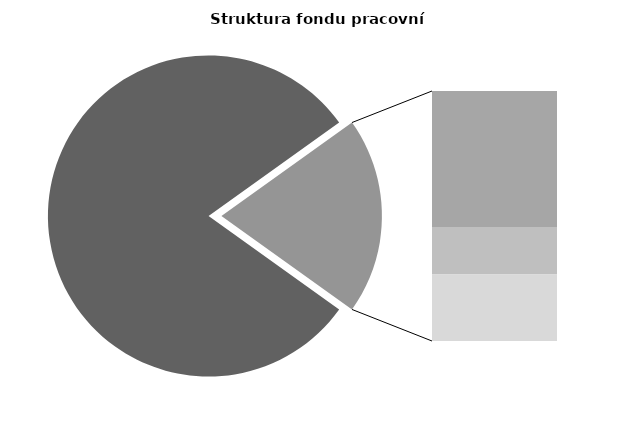
| Category | Series 0 |
|---|---|
| Průměrná měsíční odpracovaná doba bez přesčasu | 137.821 |
| Dovolená | 18.47 |
| Nemoc | 6.462 |
| Jiné | 9.037 |